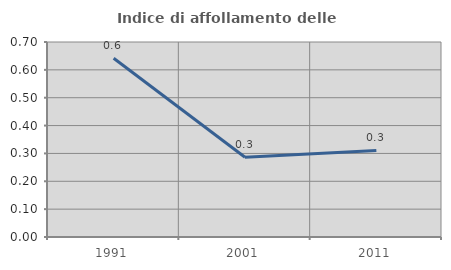
| Category | Indice di affollamento delle abitazioni  |
|---|---|
| 1991.0 | 0.642 |
| 2001.0 | 0.286 |
| 2011.0 | 0.311 |